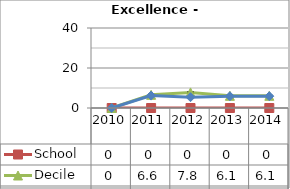
| Category | School  | Decile | National |
|---|---|---|---|
| 2010.0 | 0 | 0 | 0 |
| 2011.0 | 0 | 6.6 | 6.2 |
| 2012.0 | 0 | 7.8 | 5.4 |
| 2013.0 | 0 | 6.1 | 5.9 |
| 2014.0 | 0 | 6.1 | 5.9 |